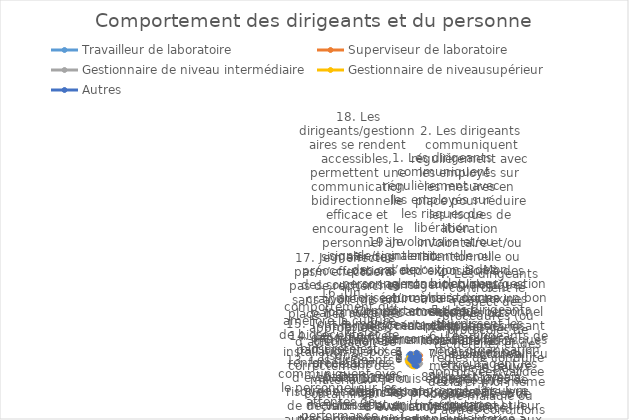
| Category | Travailleur de laboratoire | Superviseur de laboratoire | Gestionnaire de niveau intermédiaire | Gestionnaire de niveausupérieur | Autres |
|---|---|---|---|---|---|
| Comportement des dirigeants et du personnel | 3 | 2 | 1 | 1 | 1 |
| 1. Les dirigeants communiquent régulièrement avec les employés sur les risques de libération involontaire et/ou intentionnelle ou d’exposition à des agents biologiques et/ou à des toxines stockés ou manipulés dans mon installation. | 4 | 4 | 5 | 1 | 5 |
| 2. Les dirigeants communiquent régulièrement avec les employés sur les mesures en place pour réduire les risques de libération involontaire et/ou intentionnelle ou d’exposition à des agents biologiques et/ou à des toxines stockés ou manipulés dans mon ins | 3 | 0 | 5 | 1 | 0 |
| 3. Mon superviseur/gestionnaire donne un bon exemple personnel de pratiques visant à réduire les risques biologiques. | 0 | 5 | 2 | 1 | 4 |
| 4. Les dirigeants contrôlent le respect des procédures (ou protocoles de recherche) et des règles de conduite approuvées/validées. | 3 | 1 | 3 | 0 | 0 |
| 5. Les dirigeants fournissent les moyens nécessaires pour mettre en œuvre des mesures de biosécurité et de biosûreté. | 2 | 4 | 0 | 1 | 3 |
| 6. Les dirigeants de mon organisation encouragent les employés à accroître leur éducation et leur sensibilisation aux risques biologiques. | 0 | 2 | 2 | 0 | 3 |
| 7. Je suis convaincu que je peux déclarer moi-même une maladie ou d’autres conditions susceptibles d’affecter la biosécurité/biosûreté sans crainte de perdre mon emploi ni d’autres effets négatifs sur ma vie professionnelle/ma carrière.  | 1 | 3 | 5 | 0 | 0 |
| 8. Il n’est jamais approprié de suivre (« ferroutage ») un employé autorisé à entrer dans une zone réglementée. | 4 | 2 | 5 | 0 | 1 |
| 9. Je signale/signalerait un comportement inhabituel de mes collègues qui augmente le risque de libération involontaire et/ou intentionnelle d’agents biologiques et/ou de toxines, ou d’exposition à ces agents. | 3 | 0 | 1 | 3 | 5 |
| 10. Je suis engagé dans les processus d’évaluation des risques et de prise de décision pour réduire le risque de libération involontaire et/ou intentionnelle d’agents biologiques et/ou de toxines stockés ou manipulés dans mon installation. | 4 | 2 | 1 | 5 | 4 |
| 11. Mon organisation valorise la vigilance en matière de biosécurité et de biosûreté. | 3 | 1 | 2 | 5 | 0 |
| 12. Dans mon organisation, des mesures sont en place pour punir les violations délibérées de la biosécurité et de la biosûreté. | 3 | 4 | 5 | 3 | 2 |
| 13. Les dirigeants communiquent avec le personnel sur les attentes de performance spécifiques dans les domaines qui affectent la biosécurité et la biosûreté. | 5 | 0 | 5 | 4 | 2 |
| 14. Les employés participent aux processus d’évaluation des risques et de prise de décision et aux autres activités qui les concernent.  | 2 | 1 | 4 | 5 | 1 |
| 15. Tout le monde dans mon installation dispose correctement des matériaux contaminés. | 0 | 1 | 5 | 3 | 3 |
| 16. Un comportement qui améliore la culture de biosécurité et de biosûreté est renforcé par mes pairs. | 1 | 2 | 2 | 4 | 3 |
| 17. Je n’effectue pas/n’effectuerai pas de recherches sans avoir mis en place des mesures appropriées d’atténuation de risques. | 5 | 0 | 0 | 0 | 2 |
| 18. Les dirigeants/gestionnaires se rendent accessibles, permettent une communication bidirectionnelle efficace et encouragent le personnel à signaler des préoccupations ou des soupçons sans craindre de subir par la suite des mesures disciplinaires4. | 1 | 1 | 2 | 0 | 5 |
| 19. Je signale/signalerait des cas de personnel non autorisé ou mal formé/insuffisamment formé accédant à l’établissement.  | 1 | 3 | 4 | 2 | 1 |